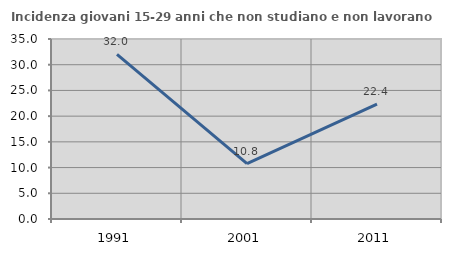
| Category | Incidenza giovani 15-29 anni che non studiano e non lavorano  |
|---|---|
| 1991.0 | 32 |
| 2001.0 | 10.784 |
| 2011.0 | 22.353 |